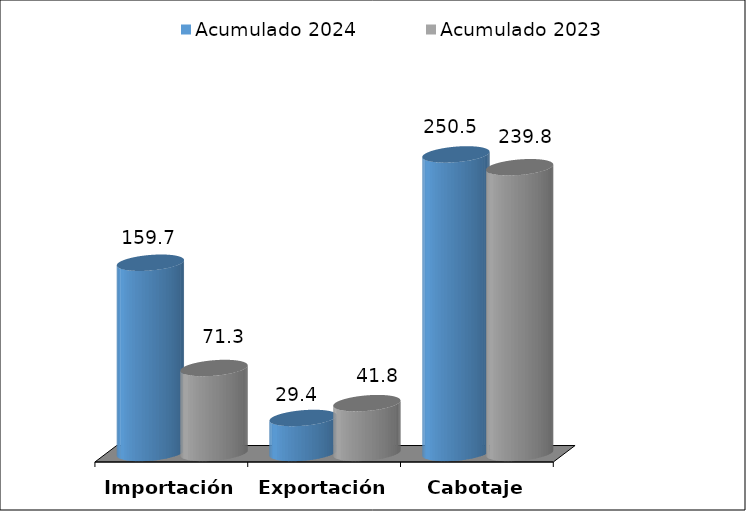
| Category | Acumulado 2024 | Acumulado 2023 |
|---|---|---|
| Importación | 159.654 | 71.32 |
| Exportación | 29.392 | 41.835 |
| Cabotaje | 250.548 | 239.8 |